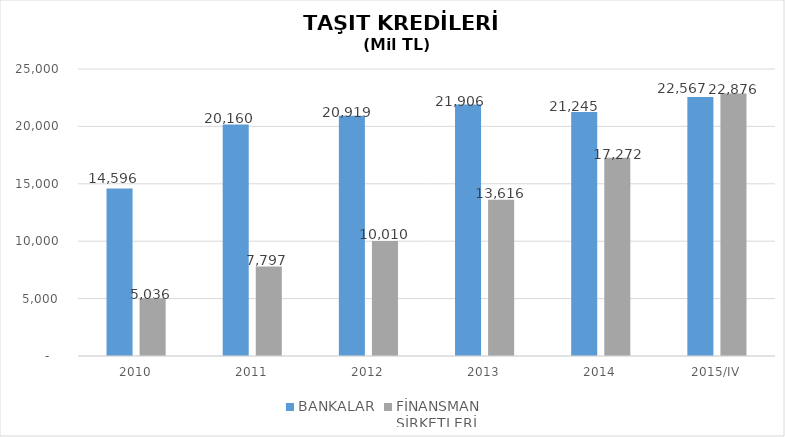
| Category | BANKALAR | FİNANSMAN 
ŞİRKETLERİ |
|---|---|---|
| 2010 | 14596 | 5035.89 |
| 2011 | 20160 | 7796.854 |
| 2012 | 20919 | 10009.755 |
| 2013 | 21906 | 13616.036 |
| 2014 | 21245 | 17271.844 |
| 2015/IV | 22567 | 22875.563 |